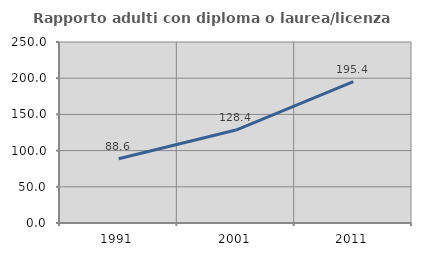
| Category | Rapporto adulti con diploma o laurea/licenza media  |
|---|---|
| 1991.0 | 88.648 |
| 2001.0 | 128.417 |
| 2011.0 | 195.409 |